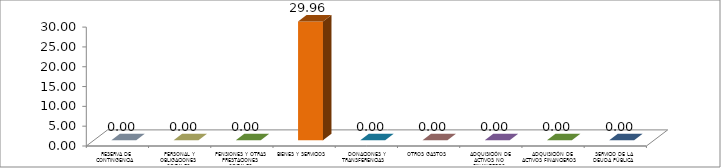
| Category | Series 0 |
|---|---|
|  RESERVA DE CONTINGENCIA | 0 |
|  PERSONAL Y OBLIGACIONES SOCIALES | 0 |
|  PENSIONES Y OTRAS PRESTACIONES SOCIALES | 0 |
|  BIENES Y SERVICIOS | 29.964 |
|   DONACIONES Y TRANSFERENCIAS | 0 |
|  OTROS GASTOS | 0 |
|  ADQUISICIÓN DE ACTIVOS NO FINANCIEROS | 0 |
|  ADQUISICIÓN DE ACTIVOS FINANCIEROS | 0 |
|  SERVICIO DE LA DEUDA PÚBLICA | 0 |